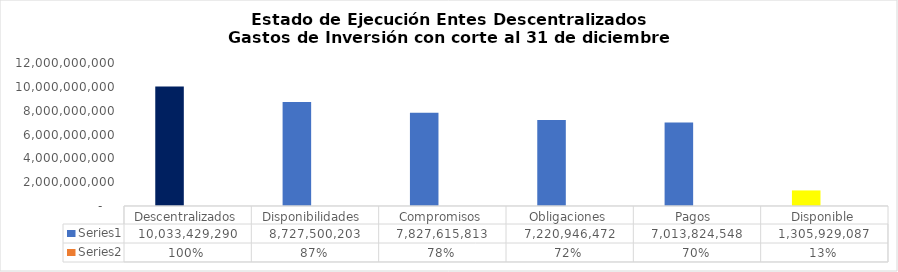
| Category | Series 0 | Series 1 |
|---|---|---|
| Descentralizados | 10033429290.13 | 1 |
| Disponibilidades  | 8727500202.95 | 0.87 |
| Compromisos | 7827615812.56 | 0.78 |
| Obligaciones | 7220946472.14 | 0.72 |
| Pagos  | 7013824548.21 | 0.699 |
|  Disponible  | 1305929087.18 | 0.13 |